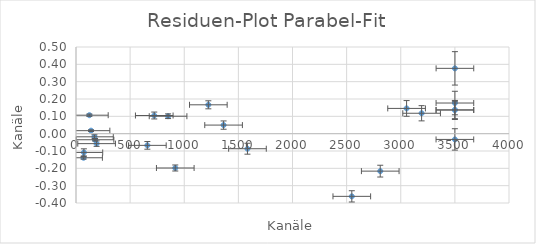
| Category | Series 0 |
|---|---|
| 72.808 | -0.108 |
| 1583.9 | -0.087 |
| 3500.2 | 0.137 |
| 2810.57 | -0.216 |
| 3192.68 | 0.118 |
| 3500.2 | 0.137 |
| 138.817 | 0.017 |
| 1222.58 | 0.167 |
| 3053.92 | 0.146 |
| 3500.24 | 0.177 |
| 170.618 | -0.018 |
| 175.811 | -0.035 |
| 1363.31 | 0.05 |
| 2547.79 | -0.362 |
| 3500.03 | -0.033 |
| 69.896 | -0.139 |
| 123.492 | 0.107 |
| 190.266 | -0.057 |
| 659.322 | -0.068 |
| 722.99 | 0.105 |
| 850.561 | 0.101 |
| 917.092 | -0.198 |
| 3500.44 | 0.377 |